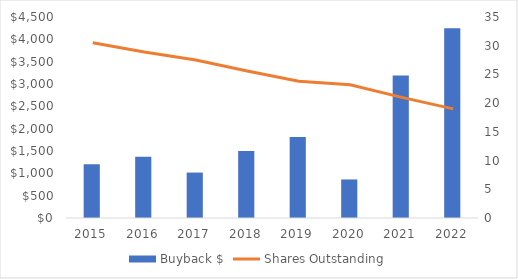
| Category | Buyback $ |
|---|---|
| 2015.0 | 1205 |
| 2016.0 | 1372 |
| 2017.0 | 1017 |
| 2018.0 | 1502 |
| 2019.0 | 1816 |
| 2020.0 | 863 |
| 2021.0 | 3191 |
| 2022.0 | 4246 |